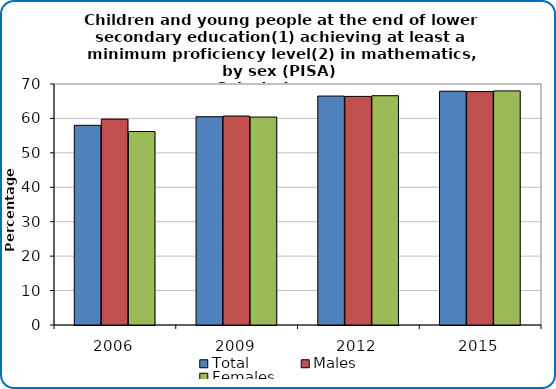
| Category | Total | Males | Females |
|---|---|---|---|
| 2006.0 | 58 | 59.8 | 56.2 |
| 2009.0 | 60.5 | 60.7 | 60.4 |
| 2012.0 | 66.5 | 66.4 | 66.6 |
| 2015.0 | 67.9 | 67.8 | 68 |